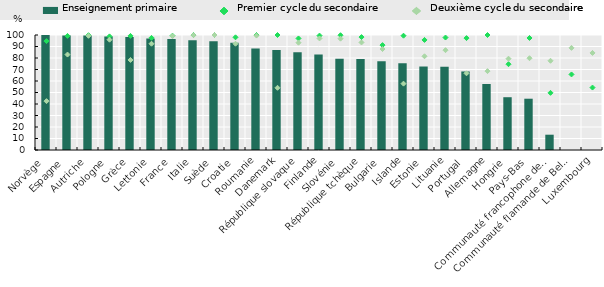
| Category | Enseignement primaire |
|---|---|
| Norvège | 100 |
| Espagne | 99.6 |
| Autriche | 99.6 |
| Pologne | 98.8 |
| Grèce | 98.2 |
| Lettonie | 96.9 |
| France | 96.6 |
| Italie | 95.5 |
| Suède | 94.6 |
| Croatie | 93.3 |
| Roumanie | 88.2 |
| Danemark | 86.9 |
| République slovaque | 85.1 |
| Finlande | 83 |
| Slovénie | 79.4 |
| République tchèque | 79.1 |
| Bulgarie | 77.2 |
| Islande | 75.4 |
| Estonie | 72.6 |
| Lituanie | 72.4 |
| Portugal | 68.3 |
| Allemagne | 57.4 |
| Hongrie | 45.9 |
| Pays­Bas | 44.6 |
| Communauté francophone de Belgique | 13.3 |
| Communauté flamande de Belgique | 0 |
| Luxembourg | 0 |